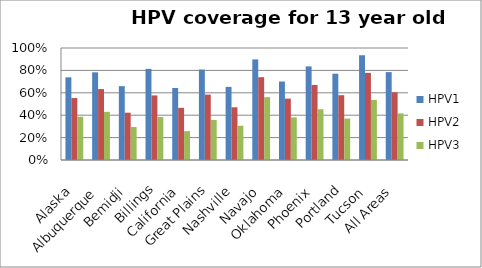
| Category | HPV1  | HPV2  | HPV3  |
|---|---|---|---|
| Alaska | 0.738 | 0.553 | 0.386 |
| Albuquerque | 0.783 | 0.633 | 0.43 |
| Bemidji | 0.659 | 0.422 | 0.294 |
| Billings | 0.813 | 0.577 | 0.384 |
| California | 0.643 | 0.466 | 0.258 |
| Great Plains | 0.807 | 0.584 | 0.358 |
| Nashville | 0.653 | 0.471 | 0.306 |
| Navajo | 0.898 | 0.739 | 0.561 |
| Oklahoma | 0.701 | 0.548 | 0.38 |
| Phoenix | 0.836 | 0.67 | 0.453 |
| Portland | 0.77 | 0.578 | 0.37 |
| Tucson | 0.935 | 0.778 | 0.537 |
| All Areas | 0.785 | 0.604 | 0.416 |